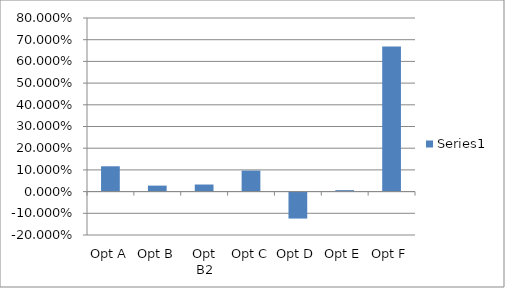
| Category | Series 0 |
|---|---|
| Opt A | 0.117 |
| Opt B | 0.028 |
| Opt B2 | 0.033 |
| Opt C | 0.097 |
| Opt D | -0.124 |
| Opt E | 0.007 |
| Opt F | 0.669 |